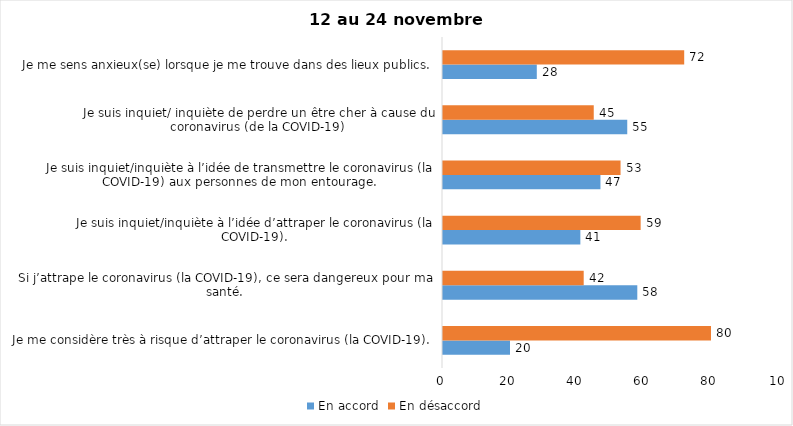
| Category | En accord | En désaccord |
|---|---|---|
| Je me considère très à risque d’attraper le coronavirus (la COVID-19). | 20 | 80 |
| Si j’attrape le coronavirus (la COVID-19), ce sera dangereux pour ma santé. | 58 | 42 |
| Je suis inquiet/inquiète à l’idée d’attraper le coronavirus (la COVID-19). | 41 | 59 |
| Je suis inquiet/inquiète à l’idée de transmettre le coronavirus (la COVID-19) aux personnes de mon entourage. | 47 | 53 |
| Je suis inquiet/ inquiète de perdre un être cher à cause du coronavirus (de la COVID-19) | 55 | 45 |
| Je me sens anxieux(se) lorsque je me trouve dans des lieux publics. | 28 | 72 |